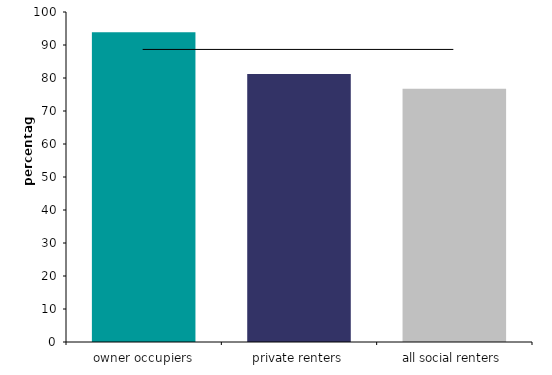
| Category | Series 0 |
|---|---|
| all social renters | 76.714 |
| private renters | 81.227 |
| owner occupiers | 93.887 |